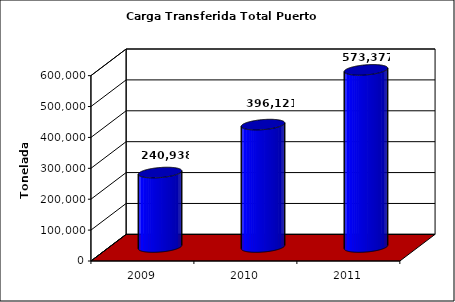
| Category | Series 0 |
|---|---|
| 2009.0 | 240938 |
| 2010.0 | 396121 |
| 2011.0 | 573377 |